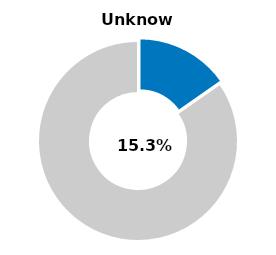
| Category | Series 0 |
|---|---|
| Unknown | 0.153 |
| Other | 0.847 |